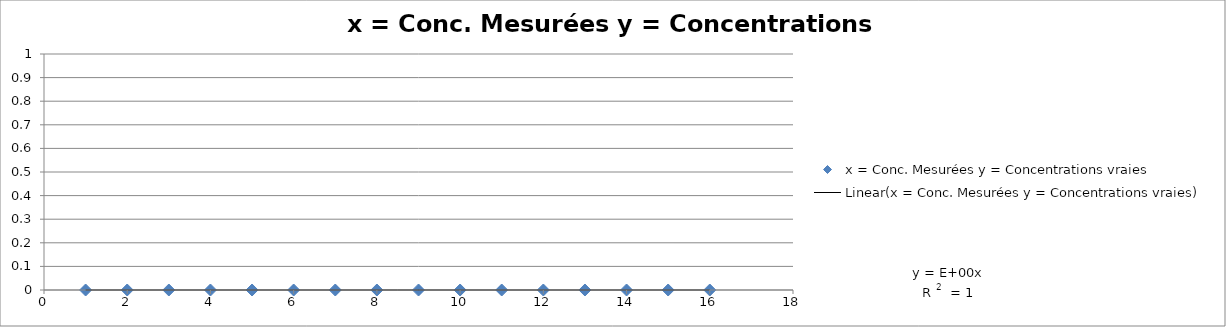
| Category | x = Conc. Mesurées y = Concentrations vraies |
|---|---|
| 0.0 | 0 |
| 0.0 | 0 |
| 0.0 | 0 |
| 0.0 | 0 |
| 0.0 | 0 |
| 0.0 | 0 |
| 0.0 | 0 |
| 0.0 | 0 |
| 0.0 | 0 |
| 0.0 | 0 |
| 0.0 | 0 |
| 0.0 | 0 |
| 0.0 | 0 |
| 0.0 | 0 |
| 0.0 | 0 |
| 0.0 | 0 |